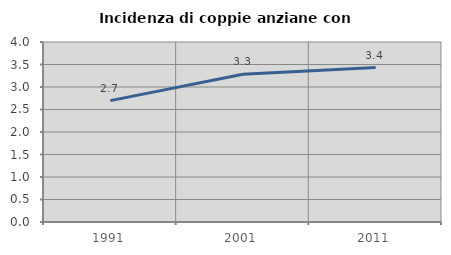
| Category | Incidenza di coppie anziane con figli |
|---|---|
| 1991.0 | 2.697 |
| 2001.0 | 3.282 |
| 2011.0 | 3.432 |